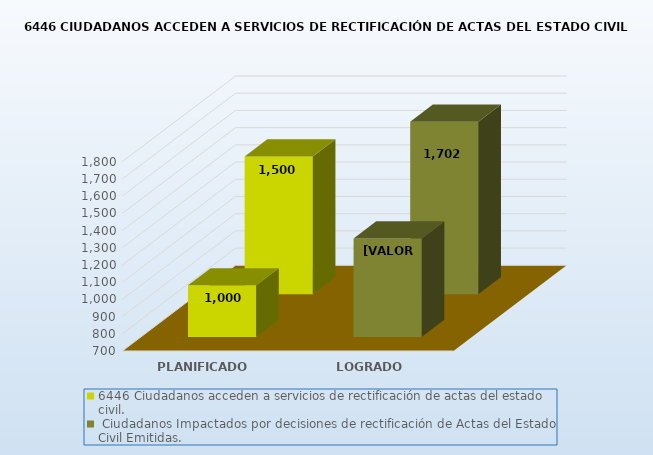
| Category | 6446 |
|---|---|
| PLANIFICADO | 1500 |
| LOGRADO | 1702 |